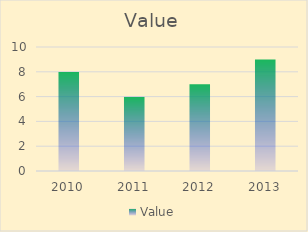
| Category | Value |
|---|---|
| 2010.0 | 8 |
| 2011.0 | 6 |
| 2012.0 | 7 |
| 2013.0 | 9 |